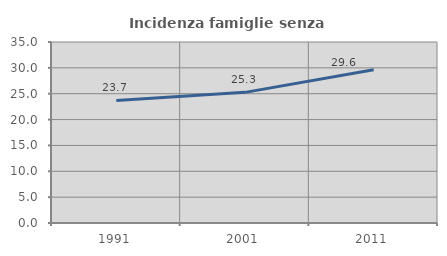
| Category | Incidenza famiglie senza nuclei |
|---|---|
| 1991.0 | 23.704 |
| 2001.0 | 25.261 |
| 2011.0 | 29.646 |